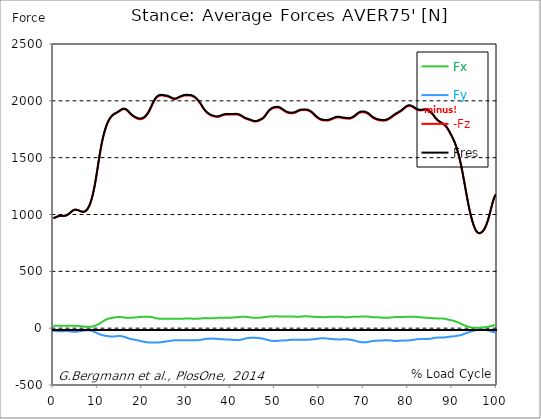
| Category |  Fx |  Fy |  -Fz |  Fres |
|---|---|---|---|---|
| 0.0 | 20.51 | -24.464 | 968.416 | 969.013 |
| 0.167348456675344 | 20.539 | -24.777 | 969.838 | 970.445 |
| 0.334696913350688 | 20.577 | -25.204 | 971.772 | 972.379 |
| 0.5020453700260321 | 20.643 | -25.754 | 974.266 | 974.892 |
| 0.669393826701376 | 20.719 | -26.399 | 977.272 | 977.917 |
| 0.83674228337672 | 20.795 | -27.081 | 980.667 | 981.33 |
| 1.0040907400520642 | 20.861 | -27.66 | 983.748 | 984.431 |
| 1.1621420602454444 | 20.899 | -28.011 | 985.977 | 986.669 |
| 1.3294905169207885 | 20.918 | -28.143 | 987.399 | 988.101 |
| 1.4968389735961325 | 20.899 | -28.096 | 988.12 | 988.812 |
| 1.6641874302714765 | 20.861 | -27.897 | 988.271 | 988.954 |
| 1.8315358869468206 | 20.795 | -27.593 | 988.015 | 988.689 |
| 1.9988843436221646 | 20.709 | -27.205 | 987.532 | 988.196 |
| 2.1662328002975086 | 20.633 | -26.787 | 987.143 | 987.797 |
| 2.333581256972853 | 20.586 | -26.38 | 987.153 | 987.807 |
| 2.5009297136481967 | 20.596 | -26.01 | 987.75 | 988.395 |
| 2.6682781703235405 | 20.652 | -25.706 | 989.03 | 989.665 |
| 2.8356266269988843 | 20.747 | -25.526 | 991.031 | 991.666 |
| 3.002975083674229 | 20.899 | -25.517 | 993.705 | 994.34 |
| 3.1703235403495724 | 21.098 | -25.725 | 996.995 | 997.649 |
| 3.337671997024917 | 21.316 | -26.114 | 1000.845 | 1001.499 |
| 3.4957233172182973 | 21.534 | -26.655 | 1005.245 | 1005.918 |
| 3.663071773893641 | 21.743 | -27.337 | 1010.232 | 1010.925 |
| 3.8304202305689854 | 21.951 | -28.134 | 1015.846 | 1016.557 |
| 3.997768687244329 | 22.17 | -29.025 | 1021.99 | 1022.73 |
| 4.165117143919673 | 22.312 | -29.907 | 1028.021 | 1028.789 |
| 4.332465600595017 | 22.34 | -30.666 | 1033.322 | 1034.109 |
| 4.499814057270361 | 22.255 | -31.235 | 1037.409 | 1038.205 |
| 4.667162513945706 | 22.056 | -31.576 | 1040.215 | 1041.021 |
| 4.834510970621049 | 21.752 | -31.709 | 1041.808 | 1042.614 |
| 5.001859427296393 | 21.354 | -31.623 | 1042.292 | 1043.088 |
| 5.169207883971737 | 20.889 | -31.32 | 1041.799 | 1042.567 |
| 5.336556340647081 | 20.349 | -30.827 | 1040.49 | 1041.239 |
| 5.503904797322425 | 19.78 | -30.144 | 1038.537 | 1039.258 |
| 5.671253253997769 | 19.183 | -29.291 | 1036.11 | 1036.802 |
| 5.82930457419115 | 18.557 | -28.286 | 1033.398 | 1034.052 |
| 5.996653030866494 | 17.903 | -27.176 | 1030.562 | 1031.179 |
| 6.164001487541838 | 17.21 | -26.019 | 1027.784 | 1028.362 |
| 6.331349944217181 | 16.49 | -24.834 | 1025.395 | 1025.935 |
| 6.498698400892526 | 15.779 | -23.658 | 1023.697 | 1024.2 |
| 6.66604685756787 | 15.067 | -22.53 | 1022.977 | 1023.441 |
| 6.833395314243213 | 14.385 | -21.458 | 1023.327 | 1023.764 |
| 7.000743770918558 | 13.74 | -20.482 | 1024.873 | 1025.281 |
| 7.168092227593902 | 13.171 | -19.676 | 1027.85 | 1028.239 |
| 7.335440684269246 | 12.678 | -19.059 | 1032.392 | 1032.762 |
| 7.50278914094459 | 12.28 | -18.671 | 1038.622 | 1038.983 |
| 7.6701375976199335 | 12.014 | -18.538 | 1046.72 | 1047.071 |
| 7.837486054295278 | 11.862 | -18.68 | 1056.781 | 1057.141 |
| 7.995537374488658 | 11.862 | -19.116 | 1068.899 | 1069.269 |
| 8.162885831164003 | 12.005 | -19.846 | 1083.199 | 1083.587 |
| 8.330234287839346 | 12.346 | -20.937 | 1099.916 | 1100.333 |
| 8.49758274451469 | 12.896 | -22.388 | 1119.193 | 1119.648 |
| 8.664931201190035 | 13.711 | -24.161 | 1141.107 | 1141.6 |
| 8.832279657865378 | 14.821 | -26.247 | 1165.713 | 1166.273 |
| 8.999628114540721 | 16.253 | -28.608 | 1193.051 | 1193.686 |
| 9.166976571216066 | 18.026 | -31.235 | 1223.242 | 1223.963 |
| 9.334325027891412 | 20.15 | -34.108 | 1256.506 | 1257.322 |
| 9.501673484566755 | 22.615 | -37.18 | 1292.757 | 1293.696 |
| 9.669021941242098 | 25.365 | -40.338 | 1331.53 | 1332.592 |
| 9.836370397917442 | 28.39 | -43.486 | 1372.133 | 1373.318 |
| 10.003718854592787 | 31.642 | -46.511 | 1413.713 | 1415.04 |
| 10.17106731126813 | 35.094 | -49.355 | 1455.349 | 1456.81 |
| 10.329118631461512 | 38.754 | -52.001 | 1496.322 | 1497.934 |
| 10.496467088136853 | 42.604 | -54.447 | 1535.863 | 1537.618 |
| 10.663815544812199 | 46.567 | -56.685 | 1573.186 | 1575.092 |
| 10.831164001487544 | 50.664 | -58.752 | 1608.062 | 1610.119 |
| 10.998512458162887 | 54.817 | -60.687 | 1640.292 | 1642.511 |
| 11.16586091483823 | 58.989 | -62.46 | 1669.848 | 1672.238 |
| 11.333209371513574 | 63.105 | -64.062 | 1696.873 | 1699.423 |
| 11.50055782818892 | 67.059 | -65.466 | 1721.508 | 1724.219 |
| 11.667906284864264 | 70.804 | -66.698 | 1743.905 | 1746.768 |
| 11.835254741539607 | 74.227 | -67.798 | 1764.282 | 1767.307 |
| 12.00260319821495 | 77.271 | -68.803 | 1782.659 | 1785.816 |
| 12.169951654890292 | 79.964 | -69.733 | 1799.082 | 1802.353 |
| 12.337300111565641 | 82.325 | -70.596 | 1813.618 | 1817.013 |
| 12.504648568240984 | 84.383 | -71.373 | 1826.419 | 1829.928 |
| 12.662699888434362 | 86.175 | -72.018 | 1837.675 | 1841.269 |
| 12.830048345109708 | 87.664 | -72.473 | 1847.565 | 1851.244 |
| 12.997396801785053 | 88.887 | -72.795 | 1856.289 | 1860.034 |
| 13.164745258460396 | 89.958 | -73.08 | 1863.922 | 1867.724 |
| 13.33209371513574 | 90.916 | -73.222 | 1870.512 | 1874.362 |
| 13.499442171811083 | 91.826 | -73.184 | 1876.135 | 1880.023 |
| 13.666790628486426 | 92.794 | -72.909 | 1880.848 | 1884.773 |
| 13.834139085161771 | 93.894 | -72.378 | 1884.783 | 1888.737 |
| 14.001487541837117 | 95.136 | -71.639 | 1888.102 | 1892.094 |
| 14.16883599851246 | 96.416 | -70.785 | 1891.136 | 1895.147 |
| 14.336184455187803 | 97.44 | -69.998 | 1894.426 | 1898.456 |
| 14.503532911863147 | 98.094 | -69.391 | 1898.191 | 1902.221 |
| 14.670881368538492 | 98.379 | -69.021 | 1902.372 | 1906.383 |
| 14.828932688731873 | 98.407 | -68.955 | 1906.791 | 1910.774 |
| 14.996281145407215 | 98.303 | -69.145 | 1911.257 | 1915.23 |
| 15.163629602082558 | 98.028 | -69.515 | 1915.742 | 1919.706 |
| 15.330978058757903 | 97.355 | -70.159 | 1920.114 | 1924.049 |
| 15.498326515433247 | 96.368 | -71.24 | 1923.859 | 1927.785 |
| 15.665674972108594 | 95.183 | -72.739 | 1926.571 | 1930.497 |
| 15.833023428783937 | 93.922 | -74.578 | 1927.937 | 1931.891 |
| 16.00037188545928 | 92.765 | -76.664 | 1927.87 | 1931.853 |
| 16.167720342134626 | 91.779 | -78.94 | 1926.382 | 1930.421 |
| 16.335068798809967 | 91.049 | -81.301 | 1923.527 | 1927.652 |
| 16.502417255485312 | 90.565 | -83.653 | 1919.441 | 1923.66 |
| 16.669765712160658 | 90.338 | -85.9 | 1914.225 | 1918.549 |
| 16.837114168836 | 90.347 | -88.015 | 1907.995 | 1912.433 |
| 17.004462625511344 | 90.537 | -90.025 | 1901.073 | 1905.634 |
| 17.16251394570472 | 90.831 | -91.959 | 1893.952 | 1898.646 |
| 17.32986240238007 | 91.172 | -93.808 | 1887.04 | 1891.866 |
| 17.497210859055414 | 91.57 | -95.534 | 1880.44 | 1885.39 |
| 17.664559315730756 | 92.035 | -97.08 | 1874.305 | 1879.368 |
| 17.8319077724061 | 92.538 | -98.436 | 1868.748 | 1873.935 |
| 17.999256229081443 | 93.021 | -99.602 | 1863.799 | 1869.08 |
| 18.166604685756788 | 93.448 | -100.683 | 1859.37 | 1864.747 |
| 18.333953142432133 | 93.865 | -101.802 | 1855.359 | 1860.821 |
| 18.501301599107478 | 94.358 | -103.006 | 1851.68 | 1857.237 |
| 18.668650055782823 | 94.918 | -104.334 | 1848.295 | 1853.975 |
| 18.835998512458165 | 95.524 | -105.708 | 1845.27 | 1851.064 |
| 19.00334696913351 | 96.15 | -107.131 | 1842.663 | 1848.57 |
| 19.170695425808855 | 96.776 | -108.667 | 1840.586 | 1846.626 |
| 19.338043882484197 | 97.392 | -110.298 | 1839.145 | 1845.308 |
| 19.496095202677576 | 97.942 | -112.014 | 1838.415 | 1844.711 |
| 19.66344365935292 | 98.407 | -113.73 | 1838.405 | 1844.825 |
| 19.830792116028263 | 98.853 | -115.304 | 1839.145 | 1845.678 |
| 19.998140572703612 | 99.298 | -116.604 | 1840.728 | 1847.356 |
| 20.165489029378953 | 99.687 | -117.675 | 1843.137 | 1849.831 |
| 20.3328374860543 | 100.038 | -118.68 | 1846.437 | 1853.207 |
| 20.500185942729644 | 100.351 | -119.723 | 1850.77 | 1857.597 |
| 20.667534399404985 | 100.616 | -120.842 | 1856.165 | 1863.059 |
| 20.83488285608033 | 100.882 | -122.018 | 1862.594 | 1869.554 |
| 21.002231312755672 | 101.128 | -123.184 | 1870.028 | 1877.045 |
| 21.16957976943102 | 101.223 | -124.17 | 1878.534 | 1885.579 |
| 21.336928226106362 | 101.072 | -124.91 | 1888.263 | 1895.308 |
| 21.504276682781704 | 100.664 | -125.432 | 1899.224 | 1906.251 |
| 21.67162513945705 | 100.057 | -125.849 | 1911.352 | 1918.322 |
| 21.82967645965043 | 99.289 | -126.171 | 1924.504 | 1931.407 |
| 21.997024916325774 | 98.331 | -126.389 | 1938.396 | 1945.213 |
| 22.16437337300112 | 97.212 | -126.513 | 1952.685 | 1959.427 |
| 22.33172182967646 | 95.913 | -126.56 | 1966.918 | 1973.556 |
| 22.499070286351806 | 94.396 | -126.522 | 1980.554 | 1987.078 |
| 22.666418743027148 | 92.765 | -126.437 | 1993.232 | 1999.642 |
| 22.833767199702496 | 91.087 | -126.342 | 2004.705 | 2010.992 |
| 23.00111565637784 | 89.418 | -126.266 | 2014.832 | 2021.005 |
| 23.168464113053183 | 87.777 | -126.2 | 2023.546 | 2029.615 |
| 23.335812569728528 | 86.336 | -126.095 | 2030.829 | 2036.803 |
| 23.50316102640387 | 85.132 | -125.915 | 2036.66 | 2042.549 |
| 23.670509483079215 | 84.193 | -125.612 | 2041.079 | 2046.892 |
| 23.83785793975456 | 83.529 | -125.166 | 2044.208 | 2049.955 |
| 23.995909259947936 | 83.055 | -124.626 | 2046.2 | 2051.88 |
| 24.163257716623285 | 82.771 | -124 | 2047.186 | 2052.809 |
| 24.330606173298627 | 82.61 | -123.308 | 2047.394 | 2052.97 |
| 24.49795462997397 | 82.524 | -122.53 | 2047.034 | 2052.553 |
| 24.665303086649313 | 82.486 | -121.629 | 2046.209 | 2051.671 |
| 24.83265154332466 | 82.439 | -120.643 | 2045.166 | 2050.571 |
| 25.0 | 82.354 | -119.543 | 2044.142 | 2049.481 |
| 25.167348456675345 | 82.268 | -118.415 | 2043.222 | 2048.485 |
| 25.334696913350694 | 82.249 | -117.305 | 2042.502 | 2047.707 |
| 25.502045370026035 | 82.278 | -116.224 | 2041.667 | 2046.807 |
| 25.669393826701377 | 82.325 | -115.229 | 2040.245 | 2045.327 |
| 25.836742283376722 | 82.344 | -114.328 | 2038.121 | 2043.156 |
| 26.004090740052067 | 82.354 | -113.474 | 2035.551 | 2040.548 |
| 26.17143919672741 | 82.448 | -112.649 | 2032.659 | 2037.618 |
| 26.329490516920792 | 82.648 | -111.796 | 2029.416 | 2034.347 |
| 26.49683897359613 | 82.866 | -110.924 | 2026.031 | 2030.924 |
| 26.66418743027148 | 83.036 | -109.975 | 2022.684 | 2027.539 |
| 26.831535886946828 | 83.131 | -109.056 | 2019.678 | 2024.495 |
| 26.998884343622166 | 83.103 | -108.278 | 2017.383 | 2022.162 |
| 27.166232800297514 | 83.008 | -107.681 | 2015.904 | 2020.645 |
| 27.333581256972852 | 82.894 | -107.264 | 2015.335 | 2020.048 |
| 27.5009297136482 | 82.847 | -106.979 | 2015.695 | 2020.379 |
| 27.668278170323543 | 82.904 | -106.799 | 2017.004 | 2021.678 |
| 27.835626626998888 | 82.989 | -106.666 | 2019.147 | 2023.803 |
| 28.002975083674233 | 83.074 | -106.533 | 2022.02 | 2026.657 |
| 28.170323540349575 | 83.16 | -106.363 | 2025.348 | 2029.966 |
| 28.33767199702492 | 83.245 | -106.135 | 2028.847 | 2033.437 |
| 28.50502045370026 | 83.283 | -105.945 | 2032.081 | 2036.66 |
| 28.663071773893645 | 83.264 | -105.851 | 2034.887 | 2039.448 |
| 28.830420230568986 | 83.292 | -105.851 | 2037.485 | 2042.037 |
| 28.99776868724433 | 83.34 | -105.993 | 2040.112 | 2044.673 |
| 29.165117143919673 | 83.416 | -106.296 | 2042.701 | 2047.271 |
| 29.33246560059502 | 83.558 | -106.619 | 2044.92 | 2049.509 |
| 29.499814057270367 | 83.795 | -106.865 | 2046.484 | 2051.102 |
| 29.66716251394571 | 84.212 | -107.036 | 2047.461 | 2052.098 |
| 29.834510970621054 | 84.734 | -107.064 | 2047.897 | 2052.572 |
| 30.00185942729639 | 85.246 | -107.036 | 2047.973 | 2052.676 |
| 30.169207883971744 | 85.682 | -107.026 | 2047.821 | 2052.553 |
| 30.33655634064708 | 85.938 | -107.045 | 2047.613 | 2052.354 |
| 30.50390479732243 | 85.919 | -107.083 | 2047.48 | 2052.221 |
| 30.671253253997772 | 85.634 | -107.102 | 2047.394 | 2052.126 |
| 30.829304574191156 | 85.122 | -107.102 | 2047.167 | 2051.87 |
| 30.996653030866494 | 84.61 | -107.112 | 2046.351 | 2051.017 |
| 31.164001487541842 | 84.155 | -107.121 | 2044.758 | 2049.414 |
| 31.331349944217187 | 83.776 | -107.131 | 2042.435 | 2047.082 |
| 31.498698400892525 | 83.444 | -107.112 | 2039.439 | 2044.066 |
| 31.666046857567874 | 83.198 | -107.074 | 2035.798 | 2040.406 |
| 31.833395314243212 | 83.046 | -106.989 | 2031.521 | 2036.129 |
| 32.00074377091856 | 83.017 | -106.846 | 2026.619 | 2031.227 |
| 32.1680922275939 | 83.093 | -106.647 | 2021.11 | 2025.718 |
| 32.33544068426925 | 83.264 | -106.401 | 2015.031 | 2019.649 |
| 32.50278914094459 | 83.501 | -106.107 | 2008.422 | 2013.031 |
| 32.670137597619934 | 83.785 | -105.727 | 2001.235 | 2005.853 |
| 32.83748605429528 | 84.155 | -105.206 | 1993.336 | 1997.954 |
| 33.004834510970625 | 84.601 | -104.495 | 1984.574 | 1989.192 |
| 33.162885831164004 | 85.113 | -103.594 | 1975.016 | 1979.634 |
| 33.33023428783935 | 85.672 | -102.522 | 1964.756 | 1969.355 |
| 33.497582744514695 | 86.251 | -101.318 | 1953.966 | 1958.555 |
| 33.664931201190036 | 86.82 | -99.991 | 1943.232 | 1947.802 |
| 33.83227965786538 | 87.351 | -98.616 | 1933.067 | 1937.618 |
| 33.99962811454073 | 87.806 | -97.269 | 1923.66 | 1928.183 |
| 34.16697657121607 | 88.157 | -96.065 | 1915.164 | 1919.659 |
| 34.33432502789141 | 88.375 | -95.088 | 1907.626 | 1912.101 |
| 34.50167348456676 | 88.432 | -94.406 | 1901.017 | 1905.473 |
| 34.6690219412421 | 88.365 | -93.827 | 1895.052 | 1899.499 |
| 34.83637039791744 | 88.233 | -93.306 | 1889.619 | 1894.047 |
| 35.00371885459279 | 88.043 | -92.86 | 1884.735 | 1889.154 |
| 35.17106731126814 | 87.844 | -92.5 | 1880.374 | 1884.773 |
| 35.338415767943474 | 87.702 | -92.244 | 1876.514 | 1880.905 |
| 35.49646708813686 | 87.607 | -92.054 | 1873.205 | 1877.595 |
| 35.6638155448122 | 87.531 | -91.902 | 1870.408 | 1874.789 |
| 35.831164001487544 | 87.455 | -91.826 | 1868.056 | 1872.437 |
| 35.998512458162885 | 87.436 | -91.893 | 1866.036 | 1870.427 |
| 36.165860914838234 | 87.578 | -92.13 | 1864.14 | 1868.549 |
| 36.333209371513576 | 87.92 | -92.433 | 1862.3 | 1866.748 |
| 36.50055782818892 | 88.46 | -92.803 | 1860.603 | 1865.107 |
| 36.667906284864266 | 89.181 | -93.277 | 1859.238 | 1863.799 |
| 36.83525474153961 | 89.977 | -93.818 | 1858.346 | 1862.983 |
| 37.002603198214956 | 90.736 | -94.349 | 1858.157 | 1862.85 |
| 37.1699516548903 | 91.39 | -94.861 | 1858.745 | 1863.505 |
| 37.337300111565646 | 91.864 | -95.373 | 1860.119 | 1864.927 |
| 37.50464856824098 | 92.158 | -95.875 | 1862.158 | 1867.004 |
| 37.66269988843437 | 92.244 | -96.387 | 1864.661 | 1869.535 |
| 37.83004834510971 | 92.168 | -96.899 | 1867.411 | 1872.295 |
| 37.99739680178505 | 91.978 | -97.392 | 1870.18 | 1875.064 |
| 38.16474525846039 | 91.713 | -97.81 | 1872.731 | 1877.624 |
| 38.33209371513574 | 91.428 | -98.198 | 1875.007 | 1879.89 |
| 38.49944217181109 | 91.153 | -98.53 | 1876.818 | 1881.701 |
| 38.666790628486424 | 90.926 | -98.834 | 1878.05 | 1882.934 |
| 38.83413908516178 | 90.745 | -99.071 | 1878.695 | 1883.579 |
| 39.001487541837115 | 90.622 | -99.242 | 1878.809 | 1883.692 |
| 39.16883599851246 | 90.556 | -99.403 | 1878.629 | 1883.512 |
| 39.336184455187805 | 90.575 | -99.602 | 1878.496 | 1883.398 |
| 39.503532911863154 | 90.67 | -99.867 | 1878.544 | 1883.455 |
| 39.670881368538495 | 90.878 | -100.199 | 1878.714 | 1883.654 |
| 39.83822982521384 | 91.21 | -100.607 | 1878.97 | 1883.948 |
| 39.996281145407224 | 91.665 | -101.1 | 1879.188 | 1884.214 |
| 40.163629602082565 | 92.244 | -101.659 | 1879.274 | 1884.366 |
| 40.33097805875791 | 92.869 | -102.266 | 1879.283 | 1884.441 |
| 40.498326515433256 | 93.486 | -102.845 | 1879.283 | 1884.508 |
| 40.6656749721086 | 94.074 | -103.366 | 1879.378 | 1884.679 |
| 40.83302342878393 | 94.624 | -103.84 | 1879.643 | 1884.991 |
| 41.00037188545929 | 95.136 | -104.248 | 1879.975 | 1885.371 |
| 41.16772034213463 | 95.657 | -104.599 | 1880.155 | 1885.598 |
| 41.33506879880997 | 96.226 | -104.817 | 1879.937 | 1885.428 |
| 41.50241725548531 | 96.833 | -104.874 | 1879.217 | 1884.745 |
| 41.66976571216066 | 97.468 | -104.722 | 1877.946 | 1883.503 |
| 41.837114168836 | 98.094 | -104.334 | 1876.135 | 1881.701 |
| 42.004462625511344 | 98.701 | -103.679 | 1873.764 | 1879.34 |
| 42.17181108218669 | 99.27 | -102.759 | 1870.863 | 1876.429 |
| 42.32986240238007 | 99.82 | -101.612 | 1867.468 | 1873.015 |
| 42.497210859055414 | 100.304 | -100.199 | 1863.571 | 1869.09 |
| 42.66455931573076 | 100.654 | -98.549 | 1859.332 | 1864.794 |
| 42.831907772406105 | 100.854 | -96.738 | 1855.046 | 1860.442 |
| 42.999256229081446 | 100.872 | -94.832 | 1851.054 | 1856.364 |
| 43.16660468575679 | 100.683 | -92.936 | 1847.499 | 1852.723 |
| 43.33395314243214 | 100.266 | -91.153 | 1844.407 | 1849.528 |
| 43.50130159910748 | 99.602 | -89.532 | 1841.8 | 1846.806 |
| 43.66865005578282 | 98.739 | -88.138 | 1839.533 | 1844.436 |
| 43.83599851245817 | 97.791 | -86.981 | 1837.495 | 1842.293 |
| 44.00334696913351 | 96.833 | -86.137 | 1835.608 | 1840.311 |
| 44.17069542580886 | 95.904 | -85.511 | 1833.692 | 1838.31 |
| 44.3380438824842 | 95.022 | -85.056 | 1831.578 | 1836.12 |
| 44.49609520267758 | 94.197 | -84.705 | 1829.198 | 1833.673 |
| 44.66344365935292 | 93.41 | -84.43 | 1826.571 | 1831.009 |
| 44.83079211602827 | 92.737 | -84.212 | 1823.888 | 1828.268 |
| 44.99814057270361 | 92.177 | -84.06 | 1821.451 | 1825.794 |
| 45.16548902937895 | 91.741 | -84.051 | 1819.592 | 1823.916 |
| 45.332837486054295 | 91.419 | -84.174 | 1818.407 | 1822.731 |
| 45.500185942729644 | 91.229 | -84.449 | 1817.952 | 1822.266 |
| 45.66753439940499 | 91.144 | -84.857 | 1818.151 | 1822.475 |
| 45.83488285608033 | 91.182 | -85.359 | 1819.004 | 1823.357 |
| 46.00223131275568 | 91.305 | -85.947 | 1820.455 | 1824.845 |
| 46.16957976943102 | 91.494 | -86.602 | 1822.494 | 1826.913 |
| 46.336928226106366 | 91.769 | -87.284 | 1825.016 | 1829.473 |
| 46.50427668278171 | 92.168 | -88.005 | 1827.785 | 1832.298 |
| 46.671625139457056 | 92.68 | -88.783 | 1830.686 | 1835.247 |
| 46.829676459650436 | 93.296 | -89.664 | 1833.74 | 1838.358 |
| 46.99702491632577 | 93.922 | -90.67 | 1837.144 | 1841.838 |
| 47.16437337300112 | 94.614 | -91.826 | 1841.155 | 1845.943 |
| 47.33172182967646 | 95.411 | -93.154 | 1846.114 | 1850.988 |
| 47.49907028635181 | 96.274 | -94.633 | 1852.183 | 1857.17 |
| 47.66641874302716 | 97.212 | -96.274 | 1859.465 | 1864.567 |
| 47.83376719970249 | 98.227 | -98.142 | 1868.009 | 1873.233 |
| 48.001115656377834 | 99.317 | -100.104 | 1877.444 | 1882.811 |
| 48.16846411305319 | 100.332 | -101.963 | 1886.973 | 1892.463 |
| 48.33581256972853 | 101.166 | -103.66 | 1895.915 | 1901.529 |
| 48.50316102640387 | 101.802 | -105.244 | 1904.07 | 1909.778 |
| 48.67050948307921 | 102.238 | -106.723 | 1911.314 | 1917.108 |
| 48.837857939754564 | 102.513 | -108.041 | 1917.658 | 1923.527 |
| 49.005206396429905 | 102.74 | -109.255 | 1923.091 | 1929.027 |
| 49.163257716623285 | 102.959 | -110.345 | 1927.605 | 1933.617 |
| 49.33060617329863 | 103.186 | -111.275 | 1931.303 | 1937.372 |
| 49.49795462997397 | 103.404 | -112.005 | 1934.271 | 1940.387 |
| 49.66530308664932 | 103.613 | -112.507 | 1936.594 | 1942.748 |
| 49.832651543324666 | 103.793 | -112.773 | 1938.358 | 1944.55 |
| 50.0 | 103.916 | -112.82 | 1939.676 | 1945.868 |
| 50.16734845667534 | 103.935 | -112.63 | 1940.605 | 1946.797 |
| 50.33469691335069 | 103.831 | -112.251 | 1941.174 | 1947.337 |
| 50.50204537002604 | 103.622 | -111.711 | 1941.345 | 1947.47 |
| 50.66939382670139 | 103.404 | -111.094 | 1940.937 | 1947.015 |
| 50.836742283376715 | 103.281 | -110.469 | 1939.676 | 1945.716 |
| 51.00409074005207 | 103.253 | -109.871 | 1937.533 | 1943.545 |
| 51.17143919672741 | 103.3 | -109.321 | 1934.489 | 1940.482 |
| 51.32949051692079 | 103.376 | -108.857 | 1930.791 | 1936.774 |
| 51.496838973596134 | 103.471 | -108.534 | 1926.827 | 1932.811 |
| 51.66418743027148 | 103.594 | -108.288 | 1922.627 | 1928.61 |
| 51.831535886946824 | 103.67 | -108.032 | 1918.208 | 1924.191 |
| 51.99888434362217 | 103.689 | -107.766 | 1913.666 | 1919.659 |
| 52.16623280029752 | 103.622 | -107.482 | 1909.152 | 1915.136 |
| 52.33358125697285 | 103.546 | -107.178 | 1904.895 | 1910.869 |
| 52.5009297136482 | 103.471 | -106.818 | 1901.102 | 1907.057 |
| 52.668278170323546 | 103.338 | -106.334 | 1897.897 | 1903.823 |
| 52.835626626998895 | 103.072 | -105.661 | 1895.431 | 1901.32 |
| 53.00297508367424 | 102.75 | -104.912 | 1893.516 | 1899.357 |
| 53.17032354034958 | 102.39 | -104.125 | 1892.065 | 1897.849 |
| 53.33767199702492 | 102.029 | -103.319 | 1891.136 | 1896.863 |
| 53.50502045370027 | 101.773 | -102.532 | 1890.624 | 1896.294 |
| 53.663071773893655 | 101.641 | -101.83 | 1890.425 | 1896.057 |
| 53.83042023056899 | 101.631 | -101.29 | 1890.539 | 1896.143 |
| 53.99776868724433 | 101.669 | -100.977 | 1891.022 | 1896.607 |
| 54.16511714391967 | 101.678 | -100.91 | 1891.942 | 1897.518 |
| 54.33246560059503 | 101.622 | -100.986 | 1893.345 | 1898.911 |
| 54.49981405727037 | 101.489 | -101.119 | 1895.289 | 1900.855 |
| 54.667162513945705 | 101.347 | -101.309 | 1897.764 | 1903.321 |
| 54.834510970621054 | 101.176 | -101.479 | 1900.742 | 1906.289 |
| 55.0018594272964 | 101.024 | -101.593 | 1904.136 | 1909.674 |
| 55.169207883971744 | 100.929 | -101.669 | 1907.711 | 1913.239 |
| 55.336556340647086 | 100.92 | -101.726 | 1910.992 | 1916.501 |
| 55.50390479732243 | 101.043 | -101.84 | 1913.675 | 1919.194 |
| 55.671253253997776 | 101.366 | -102.029 | 1915.742 | 1921.29 |
| 55.83860171067312 | 101.83 | -102.285 | 1917.212 | 1922.797 |
| 55.9966530308665 | 102.484 | -102.627 | 1918.17 | 1923.812 |
| 56.16400148754184 | 103.205 | -102.93 | 1918.739 | 1924.438 |
| 56.33134994421718 | 103.85 | -103.072 | 1918.995 | 1924.741 |
| 56.498698400892536 | 104.371 | -103.091 | 1919.052 | 1924.836 |
| 56.66604685756788 | 104.703 | -102.996 | 1919.09 | 1924.883 |
| 56.83339531424321 | 104.817 | -102.807 | 1918.985 | 1924.779 |
| 57.00074377091856 | 104.77 | -102.541 | 1918.635 | 1924.419 |
| 57.16809222759391 | 104.599 | -102.2 | 1917.933 | 1923.689 |
| 57.33544068426925 | 104.277 | -101.783 | 1916.672 | 1922.399 |
| 57.5027891409446 | 103.812 | -101.299 | 1914.728 | 1920.398 |
| 57.670137597619934 | 103.253 | -100.787 | 1912.044 | 1917.677 |
| 57.83748605429528 | 102.646 | -100.294 | 1908.716 | 1914.292 |
| 58.004834510970625 | 102.02 | -99.791 | 1904.8 | 1910.328 |
| 58.16288583116401 | 101.422 | -99.204 | 1900.324 | 1905.805 |
| 58.330234287839346 | 100.872 | -98.578 | 1895.318 | 1900.742 |
| 58.497582744514695 | 100.408 | -97.961 | 1889.752 | 1895.137 |
| 58.66493120119004 | 100.019 | -97.374 | 1883.654 | 1889.002 |
| 58.832279657865385 | 99.773 | -96.814 | 1877.169 | 1882.498 |
| 58.999628114540734 | 99.621 | -96.169 | 1870.721 | 1876.021 |
| 59.16697657121607 | 99.469 | -95.382 | 1864.453 | 1869.725 |
| 59.33432502789142 | 99.317 | -94.5 | 1858.441 | 1863.675 |
| 59.50167348456676 | 99.137 | -93.571 | 1852.856 | 1858.052 |
| 59.66902194124211 | 98.872 | -92.623 | 1847.849 | 1852.998 |
| 59.83637039791745 | 98.559 | -91.694 | 1843.44 | 1848.532 |
| 60.00371885459278 | 98.217 | -90.821 | 1839.628 | 1844.663 |
| 60.17106731126813 | 97.848 | -90.025 | 1836.376 | 1841.363 |
| 60.33841576794349 | 97.478 | -89.323 | 1833.664 | 1838.604 |
| 60.49646708813685 | 97.136 | -88.764 | 1831.521 | 1836.433 |
| 60.6638155448122 | 96.852 | -88.394 | 1829.966 | 1834.84 |
| 60.831164001487544 | 96.634 | -88.271 | 1828.894 | 1833.759 |
| 60.99851245816289 | 96.539 | -88.375 | 1828.041 | 1832.905 |
| 61.16586091483824 | 96.605 | -88.707 | 1827.216 | 1832.109 |
| 61.333209371513576 | 96.88 | -89.247 | 1826.533 | 1831.464 |
| 61.50055782818892 | 97.345 | -89.987 | 1826.107 | 1831.104 |
| 61.667906284864266 | 97.952 | -90.859 | 1826.069 | 1831.151 |
| 61.835254741539615 | 98.578 | -91.751 | 1826.524 | 1831.692 |
| 62.002603198214956 | 99.109 | -92.585 | 1827.567 | 1832.801 |
| 62.16995165489029 | 99.488 | -93.277 | 1829.16 | 1834.451 |
| 62.33730011156564 | 99.725 | -93.865 | 1831.18 | 1836.509 |
| 62.504648568240995 | 99.839 | -94.434 | 1833.503 | 1838.851 |
| 62.67199702491633 | 99.848 | -95.031 | 1836.006 | 1841.392 |
| 62.83004834510971 | 99.763 | -95.638 | 1838.642 | 1844.037 |
| 62.99739680178505 | 99.621 | -96.207 | 1841.382 | 1846.797 |
| 63.1647452584604 | 99.507 | -96.767 | 1844.142 | 1849.566 |
| 63.33209371513575 | 99.45 | -97.288 | 1846.854 | 1852.287 |
| 63.4994421718111 | 99.498 | -97.743 | 1849.395 | 1854.838 |
| 63.666790628486424 | 99.659 | -98.104 | 1851.633 | 1857.104 |
| 63.83413908516177 | 99.858 | -98.398 | 1853.359 | 1858.839 |
| 64.00148754183712 | 100.029 | -98.635 | 1854.449 | 1859.949 |
| 64.16883599851248 | 100.161 | -98.834 | 1854.914 | 1860.423 |
| 64.3361844551878 | 100.256 | -98.976 | 1854.809 | 1860.328 |
| 64.50353291186315 | 100.266 | -99.042 | 1854.212 | 1859.74 |
| 64.6708813685385 | 100.142 | -98.957 | 1853.197 | 1858.716 |
| 64.83822982521384 | 99.877 | -98.739 | 1851.917 | 1857.408 |
| 65.00557828188919 | 99.441 | -98.398 | 1850.552 | 1856.004 |
| 65.16362960208257 | 98.862 | -98.018 | 1849.272 | 1854.677 |
| 65.3309780587579 | 98.18 | -97.639 | 1848.096 | 1853.453 |
| 65.49832651543326 | 97.43 | -97.336 | 1847.11 | 1852.41 |
| 65.6656749721086 | 96.729 | -97.212 | 1846.275 | 1851.538 |
| 65.83302342878395 | 96.236 | -97.326 | 1845.498 | 1850.741 |
| 66.00037188545929 | 95.942 | -97.582 | 1844.739 | 1849.983 |
| 66.16772034213463 | 95.866 | -97.923 | 1843.99 | 1849.253 |
| 66.33506879880998 | 96.084 | -98.445 | 1843.298 | 1848.608 |
| 66.50241725548531 | 96.568 | -99.128 | 1842.748 | 1848.124 |
| 66.66976571216065 | 97.212 | -99.943 | 1842.568 | 1848.02 |
| 66.83711416883601 | 97.923 | -100.844 | 1843.013 | 1848.551 |
| 67.00446262551135 | 98.568 | -101.792 | 1844.246 | 1849.86 |
| 67.1718110821867 | 99.118 | -102.807 | 1846.237 | 1851.927 |
| 67.32986240238007 | 99.573 | -103.897 | 1848.854 | 1854.62 |
| 67.49721085905541 | 99.934 | -105.092 | 1852.003 | 1857.844 |
| 67.66455931573076 | 100.199 | -106.372 | 1855.634 | 1861.551 |
| 67.83190777240611 | 100.379 | -107.747 | 1859.788 | 1865.771 |
| 67.99925622908145 | 100.474 | -109.255 | 1864.462 | 1870.521 |
| 68.16660468575678 | 100.522 | -110.952 | 1869.64 | 1875.765 |
| 68.33395314243214 | 100.607 | -112.858 | 1874.95 | 1881.17 |
| 68.50130159910749 | 100.768 | -115.001 | 1880.336 | 1886.679 |
| 68.66865005578282 | 100.986 | -117.173 | 1885.494 | 1891.951 |
| 68.83599851245816 | 101.214 | -119.05 | 1889.894 | 1896.456 |
| 69.00334696913352 | 101.47 | -120.586 | 1893.421 | 1900.078 |
| 69.17069542580886 | 101.764 | -121.838 | 1896.152 | 1902.903 |
| 69.3380438824842 | 102.096 | -122.824 | 1898.191 | 1905.018 |
| 69.50539233915956 | 102.447 | -123.573 | 1899.547 | 1906.44 |
| 69.66344365935292 | 102.788 | -124.132 | 1900.239 | 1907.189 |
| 69.83079211602826 | 103.072 | -124.502 | 1900.296 | 1907.294 |
| 69.99814057270362 | 103.281 | -124.701 | 1899.793 | 1906.82 |
| 70.16548902937896 | 103.328 | -124.758 | 1898.902 | 1905.938 |
| 70.33283748605429 | 103.243 | -124.626 | 1897.489 | 1904.525 |
| 70.50018594272964 | 103.034 | -124.227 | 1895.412 | 1902.42 |
| 70.667534399405 | 102.665 | -123.545 | 1892.644 | 1899.604 |
| 70.83488285608033 | 102.162 | -122.587 | 1889.249 | 1896.133 |
| 71.00223131275568 | 101.517 | -121.392 | 1885.229 | 1892.027 |
| 71.16957976943102 | 100.787 | -120.008 | 1880.611 | 1887.305 |
| 71.33692822610637 | 99.981 | -118.481 | 1875.386 | 1881.957 |
| 71.50427668278171 | 99.204 | -117.021 | 1869.801 | 1876.277 |
| 71.67162513945706 | 98.483 | -115.741 | 1864.197 | 1870.578 |
| 71.8389735961324 | 97.829 | -114.65 | 1858.849 | 1865.145 |
| 71.99702491632577 | 97.288 | -113.711 | 1854.003 | 1860.243 |
| 72.16437337300113 | 96.861 | -112.868 | 1849.66 | 1855.833 |
| 72.33172182967647 | 96.568 | -112.166 | 1845.716 | 1851.851 |
| 72.49907028635181 | 96.34 | -111.559 | 1842.226 | 1848.323 |
| 72.66641874302715 | 96.141 | -111 | 1839.249 | 1845.318 |
| 72.8337671997025 | 95.913 | -110.506 | 1836.746 | 1842.776 |
| 73.00111565637783 | 95.648 | -110.051 | 1834.584 | 1840.576 |
| 73.16846411305319 | 95.325 | -109.644 | 1832.678 | 1838.642 |
| 73.33581256972853 | 94.937 | -109.264 | 1831.018 | 1836.945 |
| 73.50316102640387 | 94.481 | -108.913 | 1829.605 | 1835.494 |
| 73.67050948307921 | 93.969 | -108.629 | 1828.458 | 1834.309 |
| 73.83785793975457 | 93.429 | -108.373 | 1827.548 | 1833.36 |
| 74.00520639642991 | 92.926 | -108.107 | 1826.751 | 1832.535 |
| 74.16325771662328 | 92.557 | -107.861 | 1826.059 | 1831.805 |
| 74.33060617329863 | 92.272 | -107.614 | 1825.566 | 1831.284 |
| 74.49795462997398 | 92.054 | -107.387 | 1825.414 | 1831.113 |
| 74.66530308664932 | 91.855 | -107.159 | 1825.746 | 1831.417 |
| 74.83265154332466 | 91.675 | -106.941 | 1826.638 | 1832.289 |
| 75.00000000000001 | 91.57 | -106.751 | 1828.088 | 1833.721 |
| 75.16734845667534 | 91.57 | -106.609 | 1830.08 | 1835.693 |
| 75.3346969133507 | 91.656 | -106.562 | 1832.554 | 1838.158 |
| 75.50204537002605 | 91.845 | -106.676 | 1835.541 | 1841.164 |
| 75.66939382670138 | 92.139 | -106.941 | 1839.002 | 1844.644 |
| 75.83674228337672 | 92.547 | -107.339 | 1842.862 | 1848.542 |
| 76.00409074005208 | 93.078 | -107.88 | 1847.091 | 1852.828 |
| 76.17143919672742 | 93.713 | -108.534 | 1851.642 | 1857.436 |
| 76.33878765340276 | 94.387 | -109.264 | 1856.421 | 1862.281 |
| 76.49683897359614 | 95.079 | -110.004 | 1861.276 | 1867.203 |
| 76.66418743027148 | 95.771 | -110.744 | 1866.065 | 1872.067 |
| 76.83153588694682 | 96.416 | -111.436 | 1870.711 | 1876.77 |
| 76.99888434362218 | 96.994 | -112.043 | 1875.13 | 1881.255 |
| 77.16623280029752 | 97.449 | -112.479 | 1879.293 | 1885.466 |
| 77.33358125697285 | 97.724 | -112.706 | 1883.161 | 1889.363 |
| 77.5009297136482 | 97.876 | -112.697 | 1886.973 | 1893.184 |
| 77.66827817032356 | 97.923 | -112.441 | 1890.889 | 1897.081 |
| 77.83562662699889 | 97.971 | -111.986 | 1894.872 | 1901.035 |
| 78.00297508367423 | 98.066 | -111.436 | 1898.883 | 1905.009 |
| 78.17032354034959 | 98.161 | -110.762 | 1902.875 | 1908.953 |
| 78.33767199702493 | 98.274 | -110.061 | 1907.057 | 1913.087 |
| 78.50502045370027 | 98.417 | -109.425 | 1911.599 | 1917.582 |
| 78.67236891037561 | 98.587 | -108.999 | 1916.539 | 1922.484 |
| 78.83042023056899 | 98.796 | -108.771 | 1921.802 | 1927.728 |
| 78.99776868724433 | 99.033 | -108.724 | 1927.311 | 1933.228 |
| 79.16511714391969 | 99.213 | -108.828 | 1933.019 | 1938.936 |
| 79.33246560059503 | 99.298 | -108.942 | 1938.623 | 1944.531 |
| 79.49981405727036 | 99.374 | -108.951 | 1943.763 | 1949.651 |
| 79.66716251394571 | 99.507 | -108.771 | 1948.134 | 1954.003 |
| 79.83451097062107 | 99.687 | -108.458 | 1951.604 | 1957.455 |
| 80.00185942729641 | 99.905 | -108.032 | 1954.051 | 1959.882 |
| 80.16920788397174 | 100.133 | -107.529 | 1955.492 | 1961.295 |
| 80.33655634064709 | 100.36 | -106.951 | 1955.824 | 1961.599 |
| 80.50390479732243 | 100.579 | -106.296 | 1955.094 | 1960.84 |
| 80.67125325399778 | 100.778 | -105.547 | 1953.416 | 1959.133 |
| 80.83860171067312 | 100.92 | -104.713 | 1950.912 | 1956.592 |
| 80.99665303086651 | 100.948 | -103.774 | 1947.707 | 1953.349 |
| 81.16400148754184 | 100.872 | -102.778 | 1943.971 | 1949.556 |
| 81.3313499442172 | 100.683 | -101.726 | 1939.799 | 1945.327 |
| 81.49869840089255 | 100.351 | -100.645 | 1935.333 | 1940.804 |
| 81.66604685756786 | 99.953 | -99.621 | 1930.886 | 1936.291 |
| 81.83339531424322 | 99.507 | -98.739 | 1926.846 | 1932.185 |
| 82.00074377091858 | 99.004 | -97.99 | 1923.366 | 1928.648 |
| 82.16809222759392 | 98.436 | -97.364 | 1920.531 | 1925.746 |
| 82.33544068426926 | 97.8 | -96.833 | 1918.331 | 1923.489 |
| 82.50278914094459 | 97.08 | -96.397 | 1916.786 | 1921.878 |
| 82.67013759761994 | 96.311 | -96.037 | 1915.894 | 1920.929 |
| 82.83748605429528 | 95.515 | -95.78 | 1915.638 | 1920.607 |
| 83.00483451097062 | 94.728 | -95.676 | 1916.046 | 1920.958 |
| 83.17218296764597 | 94.007 | -95.733 | 1917.051 | 1921.925 |
| 83.33023428783935 | 93.41 | -95.894 | 1918.568 | 1923.404 |
| 83.4975827445147 | 92.945 | -96.093 | 1920.199 | 1925.016 |
| 83.66493120119004 | 92.594 | -96.236 | 1921.46 | 1926.268 |
| 83.83227965786537 | 92.272 | -96.283 | 1921.783 | 1926.571 |
| 83.99962811454073 | 91.94 | -96.217 | 1921.157 | 1925.926 |
| 84.16697657121607 | 91.58 | -95.989 | 1919.611 | 1924.362 |
| 84.33432502789142 | 91.201 | -95.572 | 1917.212 | 1921.934 |
| 84.50167348456677 | 90.764 | -94.993 | 1914.064 | 1918.739 |
| 84.6690219412421 | 90.271 | -94.282 | 1910.309 | 1914.946 |
| 84.83637039791745 | 89.731 | -93.467 | 1906.071 | 1910.65 |
| 85.0037188545928 | 89.181 | -92.594 | 1901.348 | 1905.871 |
| 85.17106731126813 | 88.688 | -91.637 | 1896.038 | 1900.514 |
| 85.33841576794349 | 88.271 | -90.584 | 1890.036 | 1894.455 |
| 85.50576422461883 | 87.92 | -89.418 | 1883.266 | 1887.637 |
| 85.66381554481221 | 87.645 | -88.176 | 1875.67 | 1879.994 |
| 85.83116400148755 | 87.427 | -86.896 | 1867.212 | 1871.498 |
| 85.99851245816289 | 87.19 | -85.672 | 1858.195 | 1862.452 |
| 86.16586091483823 | 86.839 | -84.648 | 1849.509 | 1853.738 |
| 86.33320937151358 | 86.421 | -83.795 | 1841.582 | 1845.773 |
| 86.50055782818893 | 85.976 | -83.093 | 1834.451 | 1838.623 |
| 86.66790628486427 | 85.53 | -82.543 | 1828.136 | 1832.289 |
| 86.83525474153961 | 85.151 | -82.173 | 1822.617 | 1826.761 |
| 87.00260319821496 | 84.923 | -82.012 | 1817.781 | 1821.915 |
| 87.16995165489031 | 84.847 | -81.993 | 1813.391 | 1817.544 |
| 87.33730011156564 | 84.876 | -82.079 | 1809.351 | 1813.524 |
| 87.504648568241 | 84.904 | -82.183 | 1805.558 | 1809.74 |
| 87.67199702491634 | 84.857 | -82.221 | 1801.879 | 1806.07 |
| 87.83004834510972 | 84.648 | -82.154 | 1798.105 | 1802.287 |
| 87.99739680178506 | 84.136 | -81.927 | 1793.971 | 1798.115 |
| 88.1647452584604 | 83.254 | -81.481 | 1789.201 | 1793.288 |
| 88.33209371513574 | 82.069 | -80.761 | 1783.474 | 1787.476 |
| 88.49944217181108 | 80.694 | -79.869 | 1776.675 | 1780.573 |
| 88.66679062848644 | 79.196 | -78.902 | 1768.767 | 1772.57 |
| 88.83413908516178 | 77.631 | -77.897 | 1759.787 | 1763.476 |
| 89.00148754183712 | 76.076 | -76.939 | 1749.878 | 1753.482 |
| 89.16883599851246 | 74.578 | -76.067 | 1739.201 | 1742.719 |
| 89.33618445518782 | 73.156 | -75.28 | 1727.851 | 1731.284 |
| 89.50353291186315 | 71.809 | -74.635 | 1715.951 | 1719.327 |
| 89.6708813685385 | 70.491 | -74.095 | 1703.614 | 1706.933 |
| 89.83822982521386 | 69.116 | -73.62 | 1690.994 | 1694.255 |
| 90.00557828188919 | 67.59 | -73.033 | 1678.183 | 1681.388 |
| 90.16362960208257 | 65.864 | -72.359 | 1664.984 | 1668.113 |
| 90.3309780587579 | 63.939 | -71.582 | 1651.111 | 1654.164 |
| 90.49832651543326 | 61.872 | -70.719 | 1636.091 | 1639.059 |
| 90.66567497210859 | 59.691 | -69.809 | 1619.507 | 1622.399 |
| 90.83302342878395 | 57.387 | -68.851 | 1601.31 | 1604.126 |
| 91.00037188545929 | 54.959 | -67.865 | 1581.559 | 1584.299 |
| 91.16772034213463 | 52.409 | -66.86 | 1560.242 | 1562.926 |
| 91.33506879880998 | 49.735 | -65.788 | 1537.333 | 1539.941 |
| 91.50241725548533 | 46.947 | -64.565 | 1512.603 | 1515.145 |
| 91.66976571216065 | 44.074 | -63.218 | 1486.119 | 1488.585 |
| 91.83711416883601 | 41.144 | -61.72 | 1457.853 | 1460.242 |
| 92.00446262551137 | 38.147 | -60.013 | 1427.756 | 1430.07 |
| 92.1718110821867 | 35.122 | -58.088 | 1395.839 | 1398.067 |
| 92.33915953886203 | 32.079 | -55.955 | 1362.395 | 1364.528 |
| 92.49721085905541 | 29.063 | -53.632 | 1327.699 | 1329.747 |
| 92.66455931573077 | 26.105 | -51.128 | 1291.941 | 1293.895 |
| 92.83190777240611 | 23.27 | -48.54 | 1255.596 | 1257.464 |
| 92.99925622908145 | 20.586 | -45.961 | 1219.165 | 1220.938 |
| 93.1666046857568 | 18.092 | -43.457 | 1183.151 | 1184.839 |
| 93.33395314243214 | 15.807 | -41.068 | 1148.048 | 1149.65 |
| 93.50130159910749 | 13.74 | -38.783 | 1114.101 | 1115.618 |
| 93.66865005578283 | 11.862 | -36.516 | 1081.397 | 1082.838 |
| 93.83599851245818 | 10.193 | -34.288 | 1050.304 | 1051.66 |
| 94.00334696913353 | 8.743 | -32.135 | 1020.919 | 1022.199 |
| 94.17069542580886 | 7.51 | -30.049 | 993.392 | 994.587 |
| 94.3380438824842 | 6.495 | -28.039 | 967.676 | 968.795 |
| 94.50539233915954 | 5.68 | -26.152 | 944.112 | 945.156 |
| 94.66344365935292 | 5.045 | -24.369 | 922.701 | 923.678 |
| 94.83079211602828 | 4.551 | -22.701 | 903.377 | 904.287 |
| 94.99814057270362 | 4.201 | -21.193 | 886.204 | 887.058 |
| 95.16548902937897 | 3.964 | -19.799 | 871.241 | 872.038 |
| 95.33283748605432 | 3.84 | -18.528 | 858.715 | 859.474 |
| 95.50018594272963 | 3.802 | -17.4 | 848.872 | 849.584 |
| 95.66753439940499 | 3.85 | -16.442 | 841.704 | 842.377 |
| 95.83488285608034 | 3.983 | -15.636 | 837.095 | 837.74 |
| 96.00223131275567 | 4.182 | -14.982 | 834.896 | 835.512 |
| 96.16957976943102 | 4.419 | -14.479 | 834.934 | 835.531 |
| 96.33692822610638 | 4.703 | -14.1 | 836.802 | 837.389 |
| 96.50427668278171 | 5.007 | -13.835 | 840.139 | 840.708 |
| 96.67162513945706 | 5.348 | -13.711 | 844.634 | 845.203 |
| 96.8389735961324 | 5.746 | -13.778 | 850.447 | 851.006 |
| 96.99702491632577 | 6.268 | -14.053 | 858.07 | 858.63 |
| 97.16437337300111 | 6.903 | -14.527 | 867.6 | 868.159 |
| 97.33172182967647 | 7.662 | -15.2 | 879.121 | 879.68 |
| 97.49907028635181 | 8.544 | -16.063 | 892.633 | 893.212 |
| 97.66641874302715 | 9.558 | -17.125 | 908.127 | 908.725 |
| 97.8337671997025 | 10.696 | -18.367 | 925.537 | 926.153 |
| 98.00111565637785 | 11.957 | -19.79 | 944.89 | 945.535 |
| 98.16846411305319 | 13.342 | -21.373 | 965.979 | 966.661 |
| 98.33581256972855 | 14.878 | -23.08 | 988.983 | 989.713 |
| 98.50316102640389 | 16.518 | -24.919 | 1013.618 | 1014.405 |
| 98.67050948307921 | 18.225 | -26.844 | 1039.333 | 1040.187 |
| 98.83785793975456 | 19.97 | -28.826 | 1065.533 | 1066.453 |
| 99.0052063964299 | 21.676 | -30.77 | 1090.946 | 1091.932 |
| 99.17255485310525 | 23.251 | -32.581 | 1114.196 | 1115.249 |
| 99.33060617329863 | 24.654 | -34.212 | 1134.573 | 1135.683 |
| 99.49795462997399 | 25.877 | -35.615 | 1151.803 | 1152.96 |
| 99.66530308664933 | 26.892 | -36.772 | 1165.581 | 1166.785 |
| 99.83265154332467 | 27.593 | -37.597 | 1175.281 | 1176.514 |
| 100.0 | 27.973 | -38.062 | 1180.563 | 1181.814 |